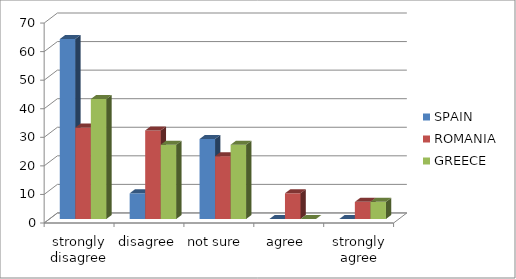
| Category | SPAIN | ROMANIA | GREECE |
|---|---|---|---|
| strongly disagree | 63 | 32 | 42 |
| disagree | 9 | 31 | 26 |
| not sure  | 28 | 22 | 26 |
| agree  | 0 | 9 | 0 |
| strongly agree | 0 | 6 | 6 |